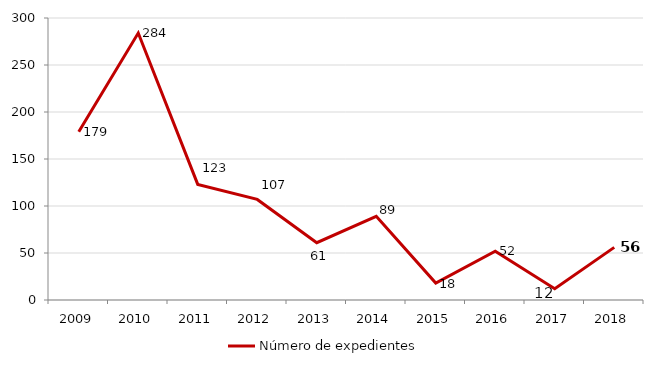
| Category | Número de expedientes |
|---|---|
| 2009.0 | 179 |
| 2010.0 | 284 |
| 2011.0 | 123 |
| 2012.0 | 107 |
| 2013.0 | 61 |
| 2014.0 | 89 |
| 2015.0 | 18 |
| 2016.0 | 52 |
| 2017.0 | 12 |
| 2018.0 | 56 |